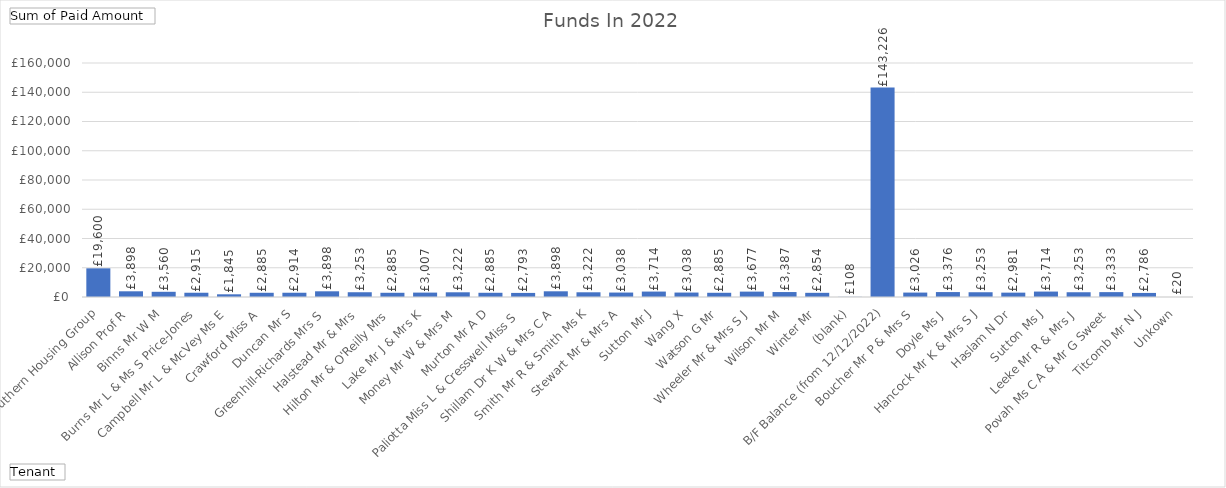
| Category | Total |
|---|---|
| Southern Housing Group | 19599.97 |
| Allison Prof R | 3897.67 |
| Binns Mr W M | 3559.99 |
| Burns Mr L & Ms S Price-Jones | 2915.43 |
| Campbell Mr L & McVey Ms E | 1845.08 |
| Crawford Miss A | 2884.75 |
| Duncan Mr S | 2914.43 |
| Greenhill-Richards Mrs S | 3897.67 |
| Halstead Mr & Mrs | 3253.05 |
| Hilton Mr & O'Reilly Mrs | 2884.75 |
| Lake Mr J & Mrs K | 3007.49 |
| Money Mr W & Mrs M | 3222.38 |
| Murton Mr A D | 2884.75 |
| Paliotta Miss L & Cresswell Miss S | 2792.66 |
| Shillam Dr K W & Mrs C A | 3897.67 |
| Smith Mr R & Smith Ms K | 3222.38 |
| Stewart Mr & Mrs A | 3038.21 |
| Sutton Mr J | 3713.51 |
| Wang X | 3038.21 |
| Watson G Mr | 2884.75 |
| Wheeler Mr & Mrs S J | 3677.11 |
| Wilson Mr M | 3386.7 |
| Winter Mr | 2854.06 |
| (blank) | 108.43 |
| B/F Balance (from 12/12/2022) | 143225.63 |
| Boucher Mr P & Mrs S | 3026.28 |
| Doyle Ms J | 3375.84 |
| Hancock Mr K & Mrs S J | 3253.05 |
| Haslam N Dr | 2981.41 |
| Sutton Ms J | 3713.51 |
| Leeke Mr R & Mrs J | 3253.05 |
| Povah Ms C A & Mr G Sweet | 3333.17 |
| Titcomb Mr N J | 2785.6 |
| Unkown | 19.62 |